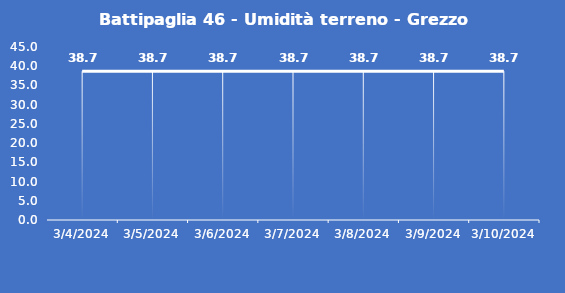
| Category | Battipaglia 46 - Umidità terreno - Grezzo (%VWC) |
|---|---|
| 3/4/24 | 38.7 |
| 3/5/24 | 38.7 |
| 3/6/24 | 38.7 |
| 3/7/24 | 38.7 |
| 3/8/24 | 38.7 |
| 3/9/24 | 38.7 |
| 3/10/24 | 38.7 |